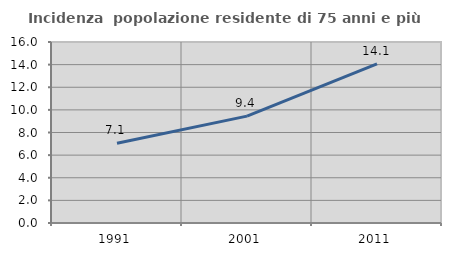
| Category | Incidenza  popolazione residente di 75 anni e più |
|---|---|
| 1991.0 | 7.053 |
| 2001.0 | 9.449 |
| 2011.0 | 14.068 |